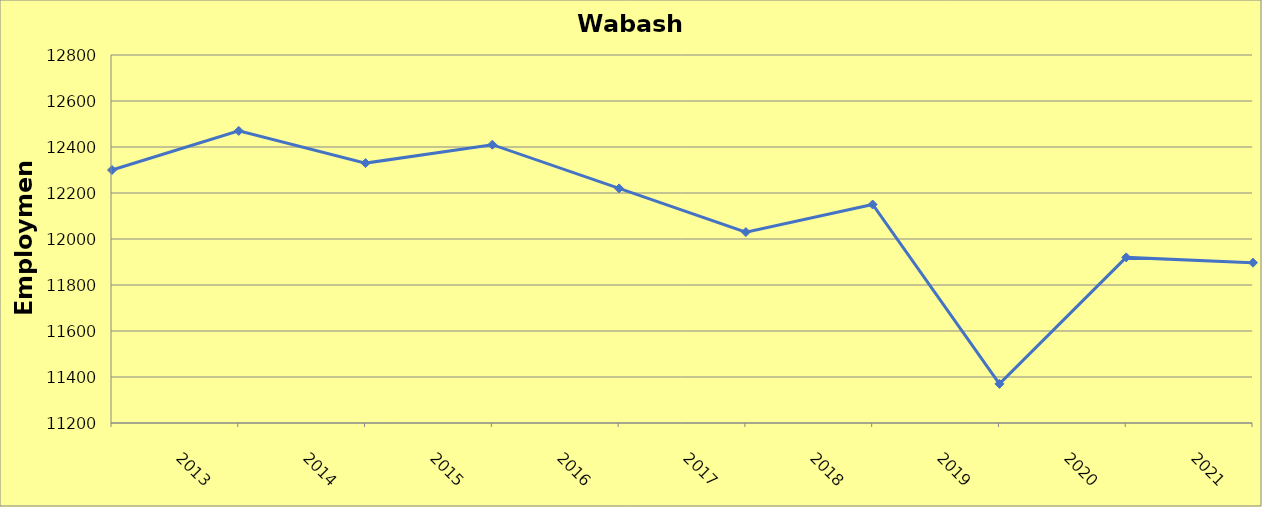
| Category | Wabash County |
|---|---|
| 2013.0 | 12300 |
| 2014.0 | 12470 |
| 2015.0 | 12330 |
| 2016.0 | 12410 |
| 2017.0 | 12220 |
| 2018.0 | 12030 |
| 2019.0 | 12150 |
| 2020.0 | 11370 |
| 2021.0 | 11920 |
| 2022.0 | 11897 |